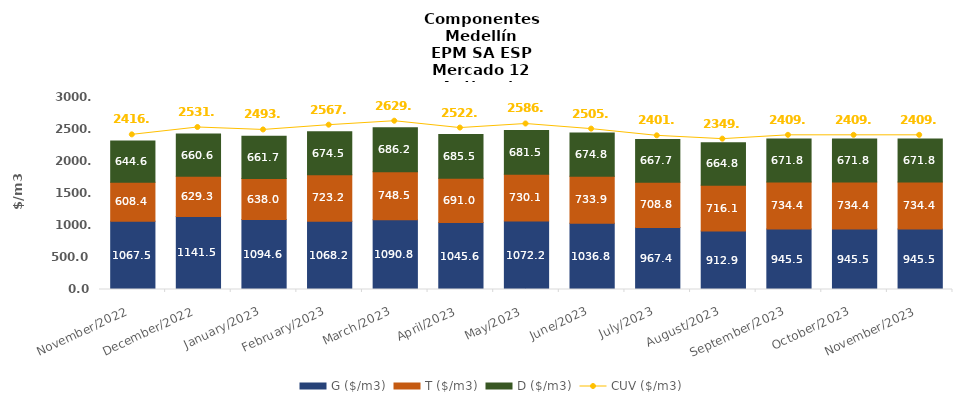
| Category | G ($/m3) | T ($/m3) | D ($/m3) |
|---|---|---|---|
| 2022-11-01 | 1067.51 | 608.44 | 644.64 |
| 2022-12-01 | 1141.53 | 629.26 | 660.56 |
| 2023-01-01 | 1094.64 | 637.95 | 661.67 |
| 2023-02-01 | 1068.19 | 723.22 | 674.52 |
| 2023-03-01 | 1090.77 | 748.48 | 686.22 |
| 2023-04-01 | 1045.58 | 690.98 | 685.49 |
| 2023-05-01 | 1072.19 | 730.14 | 681.45 |
| 2023-06-01 | 1036.8 | 733.9 | 674.81 |
| 2023-07-01 | 967.35 | 708.84 | 667.66 |
| 2023-08-01 | 912.93 | 716.07 | 664.76 |
| 2023-09-01 | 945.5 | 734.35 | 671.79 |
| 2023-10-01 | 945.5 | 734.35 | 671.79 |
| 2023-11-01 | 945.5 | 734.35 | 671.79 |